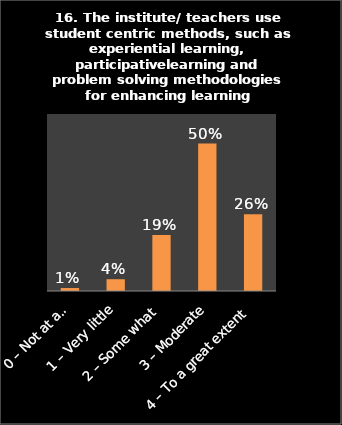
| Category | Series 0 |
|---|---|
| 0 – Not at all | 0.01 |
| 1 – Very little | 0.04 |
| 2 – Some what | 0.19 |
| 3 – Moderate | 0.5 |
| 4 – To a great extent | 0.26 |